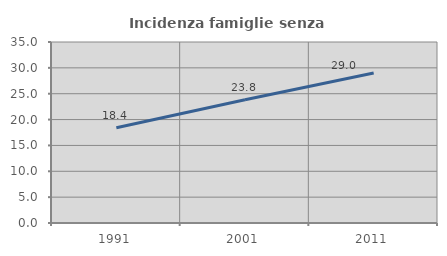
| Category | Incidenza famiglie senza nuclei |
|---|---|
| 1991.0 | 18.406 |
| 2001.0 | 23.831 |
| 2011.0 | 29.016 |